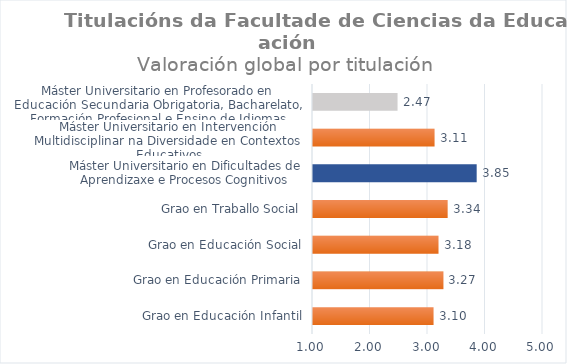
| Category | Series 0 |
|---|---|
| Grao en Educación Infantil | 3.097 |
| Grao en Educación Primaria | 3.268 |
| Grao en Educación Social | 3.183 |
| Grao en Traballo Social | 3.342 |
| Máster Universitario en Dificultades de Aprendizaxe e Procesos Cognitivos | 3.847 |
| Máster Universitario en Intervención Multidisciplinar na Diversidade en Contextos Educativos | 3.114 |
| Máster Universitario en Profesorado en Educación Secundaria Obrigatoria, Bacharelato, Formación Profesional e Ensino de Idiomas | 2.47 |